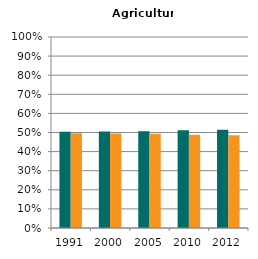
| Category | Male | Female |
|---|---|---|
| 1991.0 | 0.504 | 0.496 |
| 2000.0 | 0.506 | 0.494 |
| 2005.0 | 0.507 | 0.493 |
| 2010.0 | 0.512 | 0.488 |
| 2012.0 | 0.514 | 0.486 |